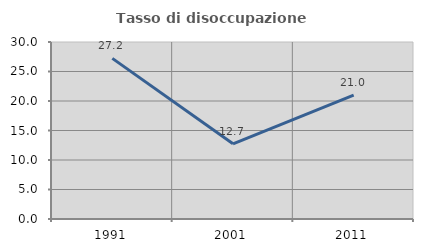
| Category | Tasso di disoccupazione giovanile  |
|---|---|
| 1991.0 | 27.225 |
| 2001.0 | 12.739 |
| 2011.0 | 20.979 |